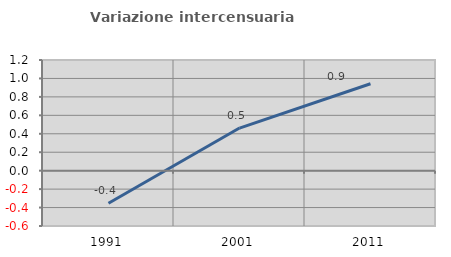
| Category | Variazione intercensuaria annua |
|---|---|
| 1991.0 | -0.353 |
| 2001.0 | 0.462 |
| 2011.0 | 0.943 |